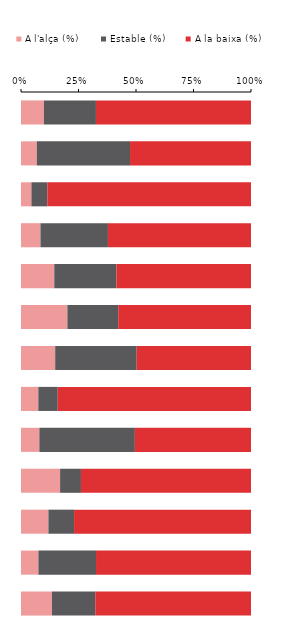
| Category | A l'alça (%) | Estable (%) | A la baixa (%) |
|---|---|---|---|
|  | 9.957 | 22.629 | 67.414 |
|  | 6.885 | 40.514 | 52.601 |
|  | 4.522 | 6.92 | 88.558 |
|  | 8.464 | 29.337 | 62.199 |
|  | 14.467 | 27.031 | 58.502 |
|  | 20.17 | 22.102 | 57.728 |
|  | 14.864 | 35.446 | 49.69 |
|  | 7.525 | 8.449 | 84.026 |
|  | 7.977 | 41.54 | 50.483 |
|  | 16.996 | 9.074 | 73.93 |
|  | 11.908 | 11.161 | 76.931 |
|  | 7.569 | 25.045 | 67.386 |
|  | 13.456 | 18.845 | 67.698 |